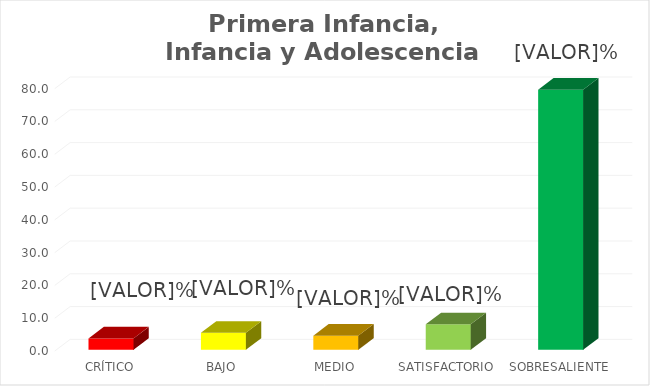
| Category | Series 0 |
|---|---|
| CRÍTICO | 3.448 |
| BAJO | 5.172 |
| MEDIO | 4.31 |
| SATISFACTORIO | 7.759 |
| SOBRESALIENTE | 79.31 |